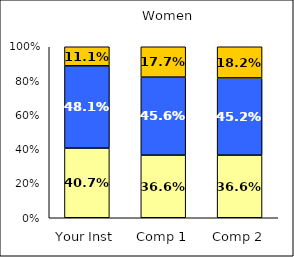
| Category | Low Academic Disengagement | Average Academic Disengagement | High Academic Disengagement |
|---|---|---|---|
| Your Inst | 0.407 | 0.481 | 0.111 |
| Comp 1 | 0.366 | 0.456 | 0.177 |
| Comp 2 | 0.366 | 0.452 | 0.182 |